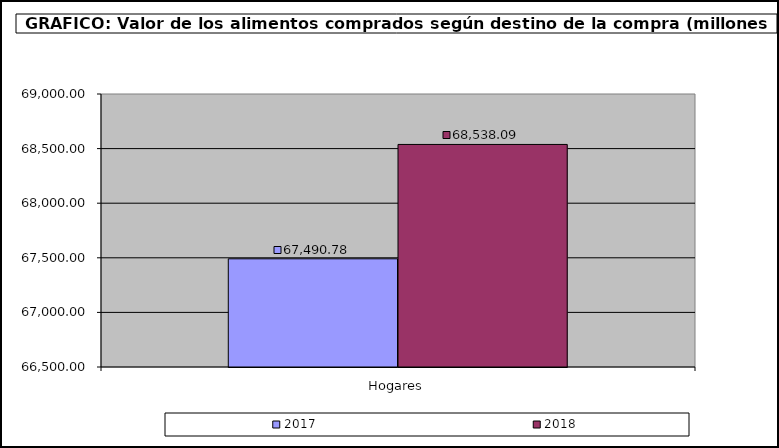
| Category | 2017 | 2018 |
|---|---|---|
| 0 | 67490.78 | 68538.087 |